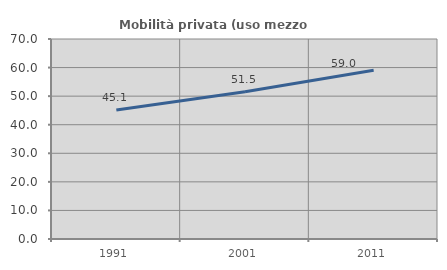
| Category | Mobilità privata (uso mezzo privato) |
|---|---|
| 1991.0 | 45.14 |
| 2001.0 | 51.502 |
| 2011.0 | 59.036 |